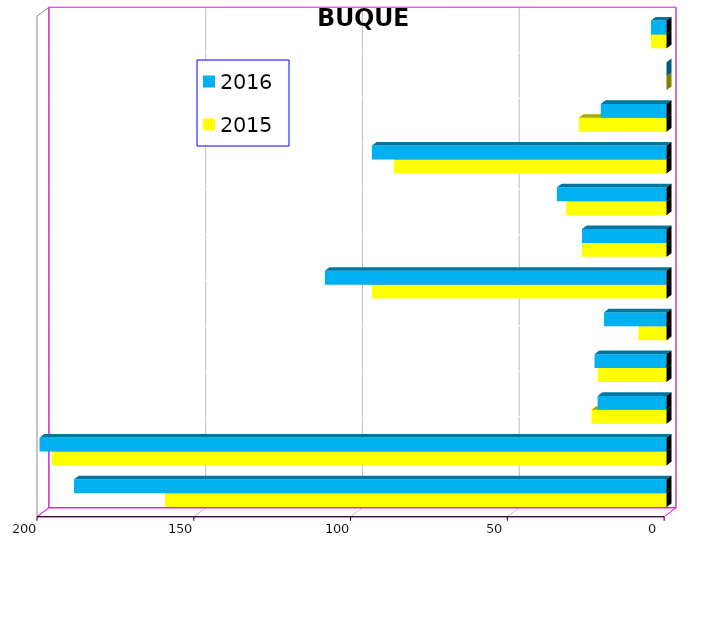
| Category | 2015 | 2016 |
|---|---|---|
| ICAVE | 160 | 189 |
| CICE | 196 | 200 |
| T. C. E. | 24 | 22 |
| CARGILL | 22 | 23 |
| TMV | 9 | 20 |
| SSA | 94 | 109 |
| SEPSA | 27 | 27 |
| VOPAK | 32 | 35 |
| CPV | 87 | 94 |
| EXCELLENCE | 28 | 21 |
| APASCO | 0 | 0 |
| SIP | 5 | 5 |